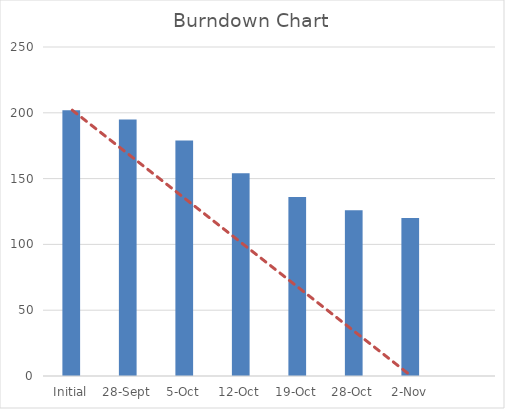
| Category | actual |
|---|---|
| Initial | 202 |
| 28-Sep | 195 |
| 5-Oct | 179 |
| 12-Oct | 154 |
| 19-Oct | 136 |
| 28-Oct | 126 |
| 2-Nov | 120 |